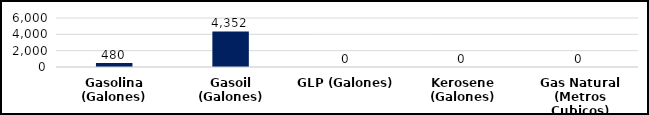
| Category | Series 0 |
|---|---|
| Gasolina (Galones) | 480 |
| Gasoil (Galones) | 4352 |
| GLP (Galones) | 0 |
| Kerosene (Galones) | 0 |
| Gas Natural (Metros Cubicos) | 0 |